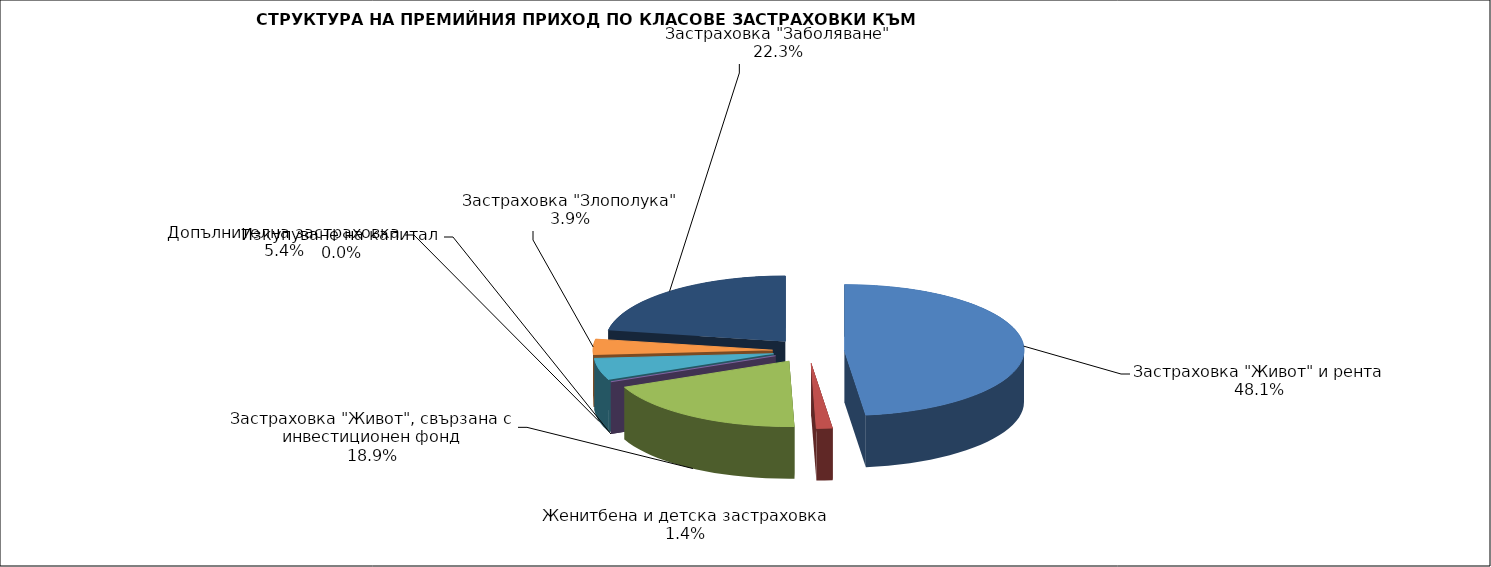
| Category | Series 0 |
|---|---|
| Застраховка "Живот" и рента | 166736469.331 |
| Женитбена и детска застраховка | 5016958.804 |
| Застраховка "Живот", свързана с инвестиционен фонд | 65637297.569 |
| Изкупуване на капитал | 0 |
| Допълнителна застраховка | 18650816.114 |
| Застраховка "Злополука" | 13354691.675 |
| Застраховка "Заболяване" | 77309897.6 |